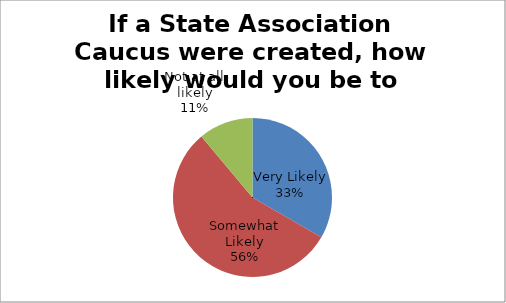
| Category | If a State Association Caucus were created, how likely would you be to participate? N=36 |
|---|---|
| Very Likely | 12 |
| Somewhat Likely | 20 |
| Not at all likely | 4 |